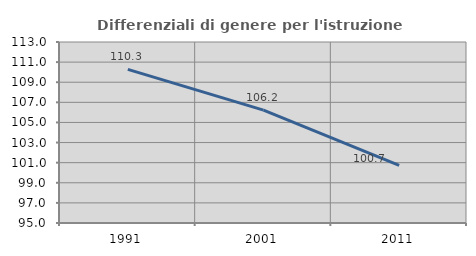
| Category | Differenziali di genere per l'istruzione superiore |
|---|---|
| 1991.0 | 110.273 |
| 2001.0 | 106.231 |
| 2011.0 | 100.732 |